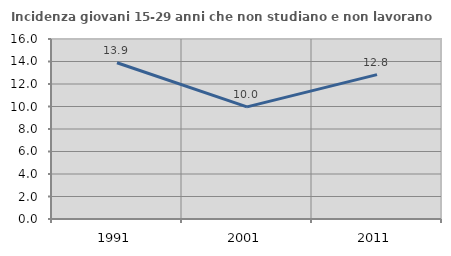
| Category | Incidenza giovani 15-29 anni che non studiano e non lavorano  |
|---|---|
| 1991.0 | 13.892 |
| 2001.0 | 9.967 |
| 2011.0 | 12.836 |